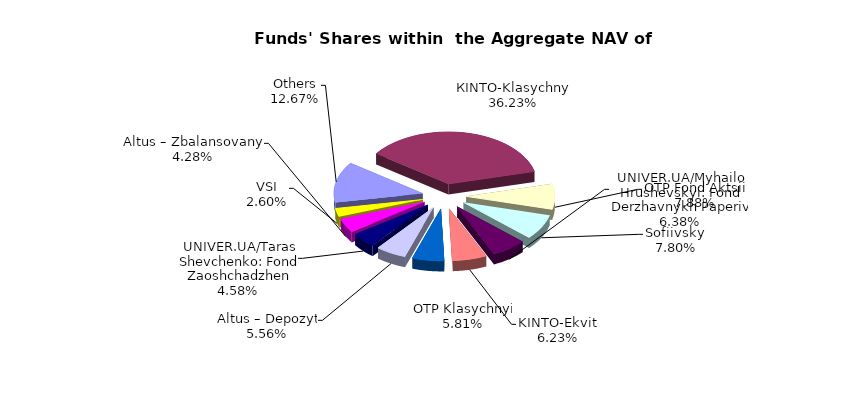
| Category | Series 0 | Series 1 |
|---|---|---|
| Others | 8435552.52 | 0.127 |
| КІNТО-Klasychnyi | 24120118.28 | 0.362 |
| ОТP Fond Aktsii | 5247749.73 | 0.079 |
| Sofiivskyi | 5190625.13 | 0.078 |
| UNIVER.UA/Myhailo Hrushevskyi: Fond Derzhavnykh Paperiv | 4245388.89 | 0.064 |
| KINTO-Ekviti | 4145263.26 | 0.062 |
| ОТP Klasychnyi | 3868102.5 | 0.058 |
| Altus – Depozyt | 3700147.24 | 0.056 |
| UNIVER.UA/Taras Shevchenko: Fond Zaoshchadzhen | 3047715.15 | 0.046 |
| Altus – Zbalansovanyi | 2847659.75 | 0.043 |
| VSI | 1733044.53 | 0.026 |